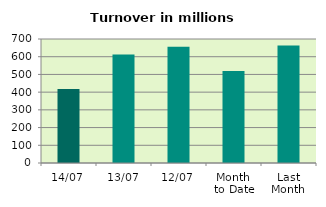
| Category | Series 0 |
|---|---|
| 14/07 | 417.461 |
| 13/07 | 612.533 |
| 12/07 | 656.949 |
| Month 
to Date | 520.052 |
| Last
Month | 663.186 |